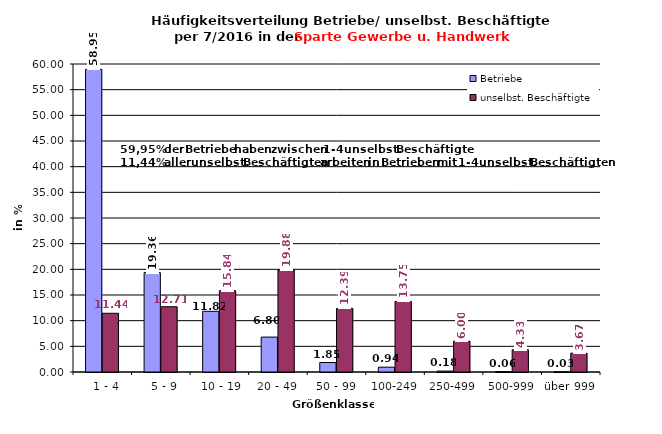
| Category | Betriebe | unselbst. Beschäftigte |
|---|---|---|
|   1 - 4 | 58.954 | 11.437 |
|   5 - 9 | 19.36 | 12.711 |
|  10 - 19 | 11.821 | 15.84 |
| 20 - 49 | 6.802 | 19.876 |
| 50 - 99 | 1.849 | 12.389 |
| 100-249 | 0.939 | 13.752 |
| 250-499 | 0.181 | 5.999 |
| 500-999 | 0.065 | 4.326 |
| über 999 | 0.029 | 3.67 |